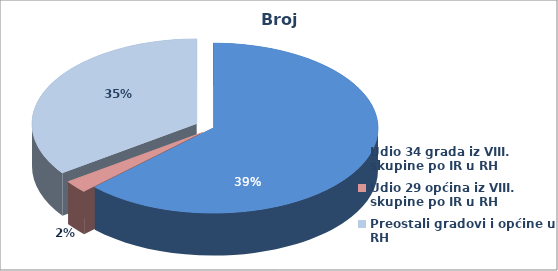
| Category | Broj zaposlenih |
|---|---|
| Udio 34 grada iz VIII. skupine po IR u RH | 0.627 |
| Udio 29 općina iz VIII. skupine po IR u RH | 0.024 |
| Preostali gradovi i općine u RH | 0.348 |